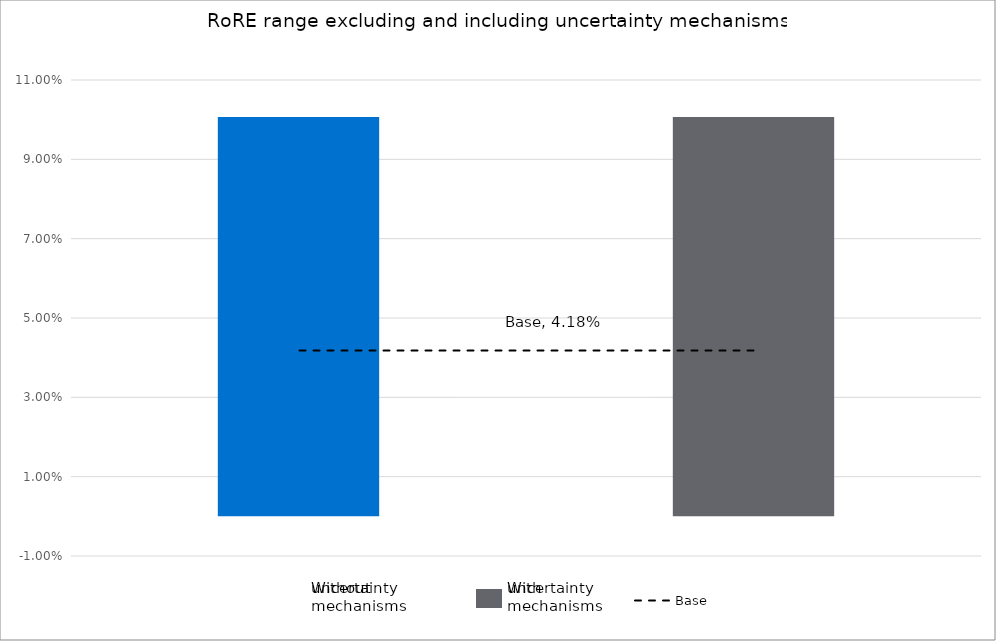
| Category | Low case | High case |
|---|---|---|
| Without uncertainty | -0.023 | 0.101 |
| Without uncertainty | -0.023 | 0.101 |